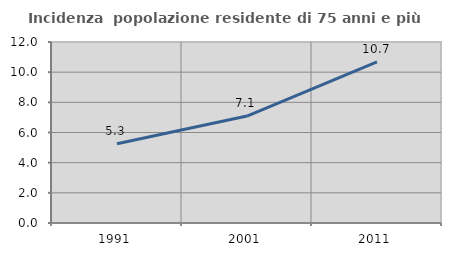
| Category | Incidenza  popolazione residente di 75 anni e più |
|---|---|
| 1991.0 | 5.252 |
| 2001.0 | 7.09 |
| 2011.0 | 10.68 |